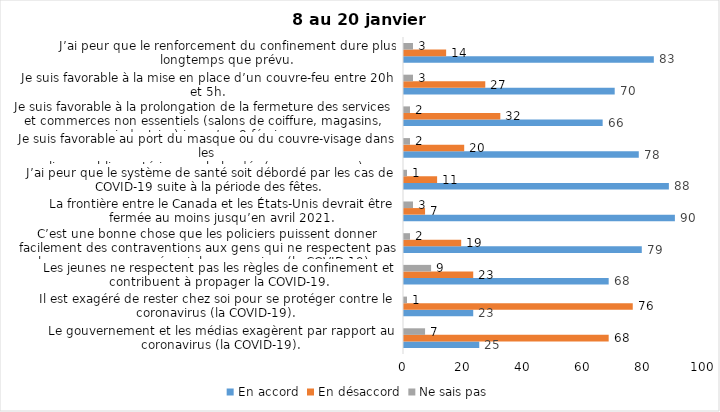
| Category | En accord | En désaccord | Ne sais pas |
|---|---|---|---|
| Le gouvernement et les médias exagèrent par rapport au coronavirus (la COVID-19). | 25 | 68 | 7 |
| Il est exagéré de rester chez soi pour se protéger contre le coronavirus (la COVID-19). | 23 | 76 | 1 |
| Les jeunes ne respectent pas les règles de confinement et contribuent à propager la COVID-19. | 68 | 23 | 9 |
| C’est une bonne chose que les policiers puissent donner facilement des contraventions aux gens qui ne respectent pas les mesures pour prévenir le coronavirus (la COVID-19). | 79 | 19 | 2 |
| La frontière entre le Canada et les États-Unis devrait être fermée au moins jusqu’en avril 2021. | 90 | 7 | 3 |
| J’ai peur que le système de santé soit débordé par les cas de COVID-19 suite à la période des fêtes. | 88 | 11 | 1 |
| Je suis favorable au port du masque ou du couvre-visage dans les
lieux publics extérieurs achalandés (ex. rues, parcs) | 78 | 20 | 2 |
| Je suis favorable à la prolongation de la fermeture des services et commerces non essentiels (salons de coiffure, magasins, industries) jusqu’au 8 février. | 66 | 32 | 2 |
| Je suis favorable à la mise en place d’un couvre-feu entre 20h et 5h. | 70 | 27 | 3 |
| J’ai peur que le renforcement du confinement dure plus longtemps que prévu. | 83 | 14 | 3 |